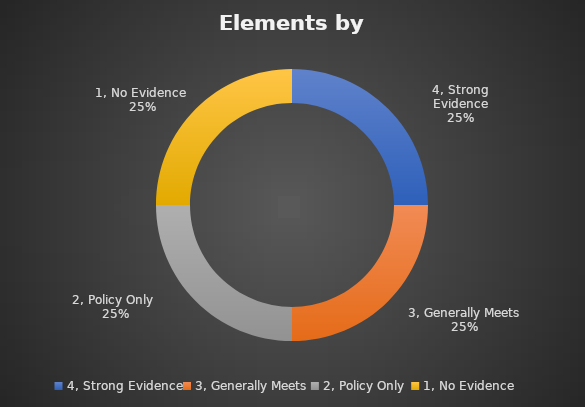
| Category | Series 1 |
|---|---|
| 4, Strong Evidence | 0 |
| 3, Generally Meets | 0 |
| 2, Policy Only  | 0 |
| 1, No Evidence  | 0 |